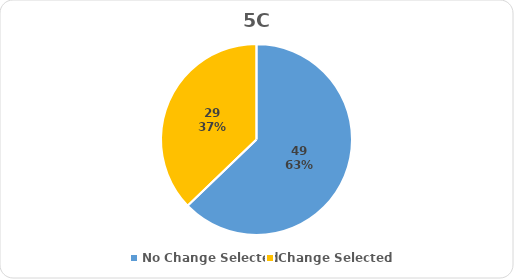
| Category | Series 0 |
|---|---|
| No Change Selected | 49 |
| Change Selected | 29 |